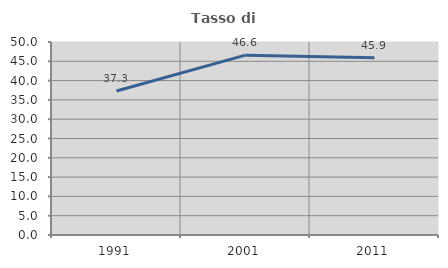
| Category | Tasso di occupazione   |
|---|---|
| 1991.0 | 37.297 |
| 2001.0 | 46.586 |
| 2011.0 | 45.934 |